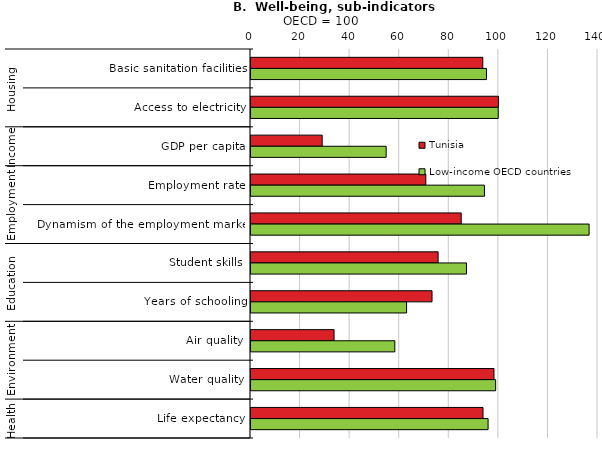
| Category | Tunisia | Low-income OECD countries |
|---|---|---|
| 0 | 93.516 | 95.013 |
| 1 | 99.824 | 99.749 |
| 2 | 28.72 | 54.531 |
| 3 | 70.539 | 94.199 |
| 4 | 84.816 | 136.409 |
| 5 | 75.495 | 86.938 |
| 6 | 73.041 | 62.772 |
| 7 | 33.509 | 58.033 |
| 8 | 98.036 | 98.705 |
| 9 | 93.602 | 95.651 |